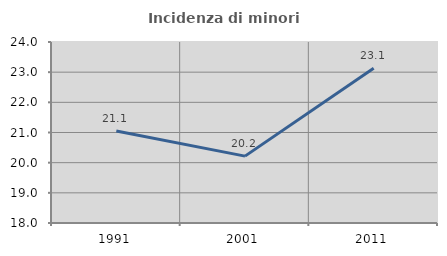
| Category | Incidenza di minori stranieri |
|---|---|
| 1991.0 | 21.053 |
| 2001.0 | 20.217 |
| 2011.0 | 23.133 |